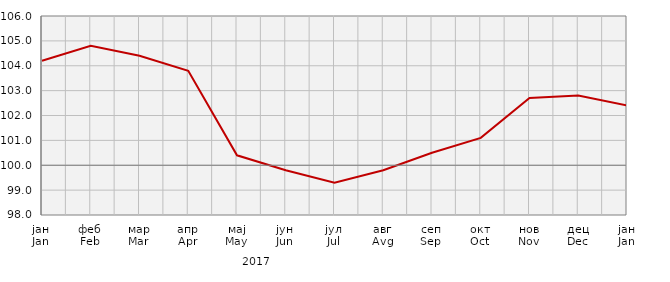
| Category | Индекси цијена произвођача
Producer price indices |
|---|---|
| јан
Jan | 104.2 |
| феб
Feb | 104.8 |
| мар
Mar | 104.4 |
| апр
Apr | 103.8 |
| мај
May | 100.4 |
| јун
Jun | 99.8 |
| јул
Jul | 99.3 |
| авг
Avg | 99.8 |
| сеп
Sep | 100.5 |
| окт
Oct | 101.1 |
| нов
Nov | 102.7 |
| дец
Dec | 102.8 |
| јан
Jan | 102.4 |